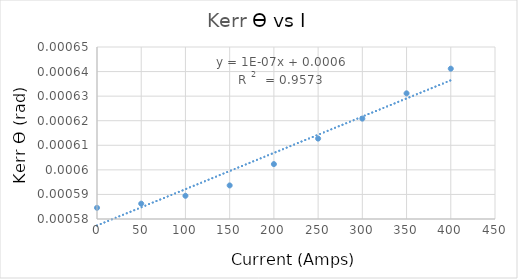
| Category | Series 0 |
|---|---|
| 0.0 | 0.001 |
| 50.0 | 0.001 |
| 100.0 | 0.001 |
| 150.0 | 0.001 |
| 200.0 | 0.001 |
| 250.0 | 0.001 |
| 300.0 | 0.001 |
| 350.0 | 0.001 |
| 400.0 | 0.001 |